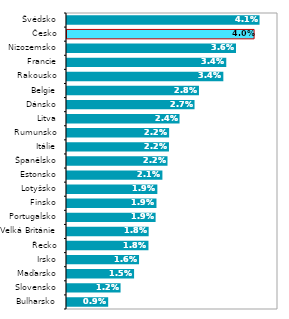
| Category | 2016 |
|---|---|
| Bulharsko | 0.009 |
| Slovensko | 0.012 |
| Maďarsko | 0.015 |
| Irsko | 0.016 |
| Řecko | 0.018 |
| Velká Británie | 0.018 |
| Portugalsko | 0.019 |
| Finsko | 0.019 |
| Lotyšsko | 0.019 |
| Estonsko | 0.021 |
| Španělsko | 0.022 |
| Itálie | 0.022 |
| Rumunsko | 0.022 |
| Litva | 0.024 |
| Dánsko | 0.027 |
| Belgie | 0.028 |
| Rakousko | 0.034 |
| Francie | 0.034 |
| Nizozemsko | 0.036 |
| Česko | 0.04 |
| Švédsko | 0.041 |